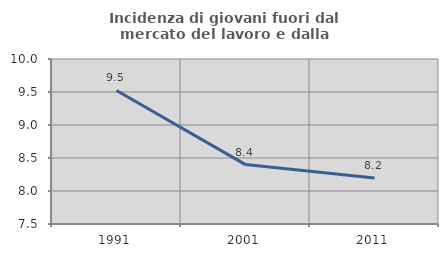
| Category | Incidenza di giovani fuori dal mercato del lavoro e dalla formazione  |
|---|---|
| 1991.0 | 9.524 |
| 2001.0 | 8.4 |
| 2011.0 | 8.197 |